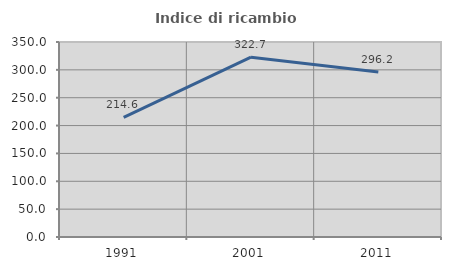
| Category | Indice di ricambio occupazionale  |
|---|---|
| 1991.0 | 214.634 |
| 2001.0 | 322.727 |
| 2011.0 | 296.154 |